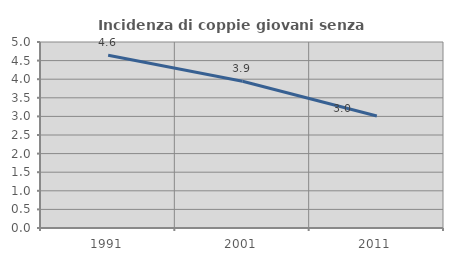
| Category | Incidenza di coppie giovani senza figli |
|---|---|
| 1991.0 | 4.646 |
| 2001.0 | 3.946 |
| 2011.0 | 3.012 |